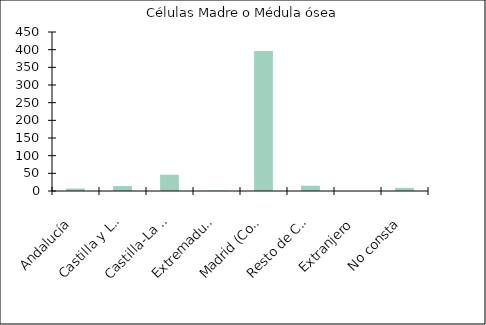
| Category | Células Madre o Médula ósea |
|---|---|
|    Andalucía | 7 |
|    Castilla y León | 14 |
|    Castilla-La Mancha | 46 |
|    Extremadura | 1 |
|    Madrid (Comunidad de) | 396 |
|    Resto de CCAA | 15 |
|    Extranjero | 0 |
|    No consta | 9 |